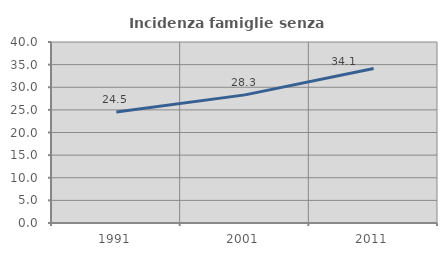
| Category | Incidenza famiglie senza nuclei |
|---|---|
| 1991.0 | 24.506 |
| 2001.0 | 28.317 |
| 2011.0 | 34.145 |